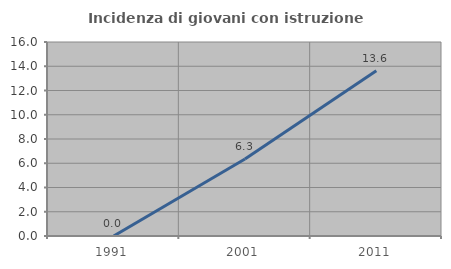
| Category | Incidenza di giovani con istruzione universitaria |
|---|---|
| 1991.0 | 0 |
| 2001.0 | 6.349 |
| 2011.0 | 13.636 |